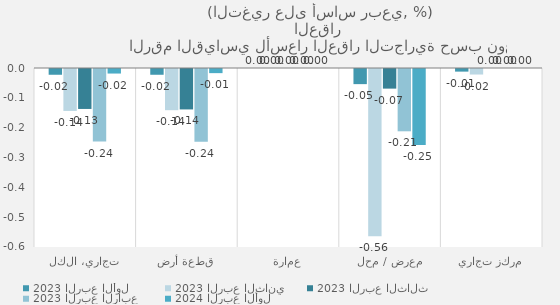
| Category | 2023 | 2024 |
|---|---|---|
| تجاري، الكل | -0.243 | -0.015 |
| قطعة أرض | -0.244 | -0.014 |
| عمارة | 0 | 0 |
| معرض / محل | -0.209 | -0.255 |
| مركز تجاري | 0 | 0 |